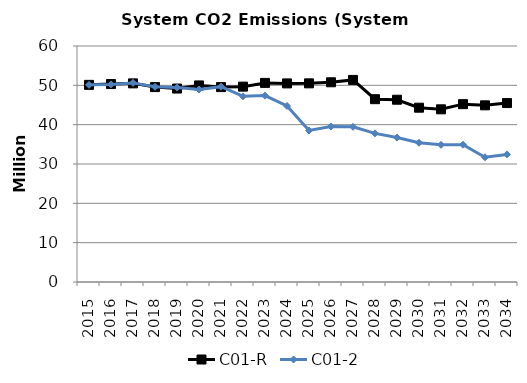
| Category | C01-R | C01-2 |
|---|---|---|
| 2015.0 | 50.118 | 50.118 |
| 2016.0 | 50.329 | 50.238 |
| 2017.0 | 50.499 | 50.622 |
| 2018.0 | 49.555 | 49.636 |
| 2019.0 | 49.181 | 49.421 |
| 2020.0 | 49.976 | 48.938 |
| 2021.0 | 49.548 | 49.665 |
| 2022.0 | 49.671 | 47.203 |
| 2023.0 | 50.618 | 47.383 |
| 2024.0 | 50.491 | 44.746 |
| 2025.0 | 50.508 | 38.519 |
| 2026.0 | 50.777 | 39.539 |
| 2027.0 | 51.38 | 39.462 |
| 2028.0 | 46.481 | 37.785 |
| 2029.0 | 46.342 | 36.715 |
| 2030.0 | 44.317 | 35.397 |
| 2031.0 | 43.901 | 34.881 |
| 2032.0 | 45.215 | 34.915 |
| 2033.0 | 44.915 | 31.713 |
| 2034.0 | 45.496 | 32.435 |